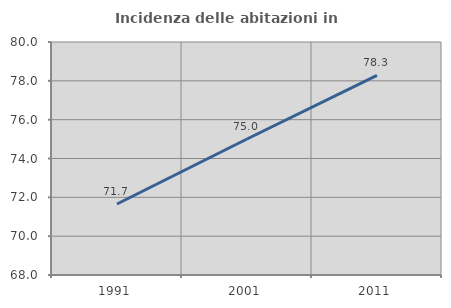
| Category | Incidenza delle abitazioni in proprietà  |
|---|---|
| 1991.0 | 71.658 |
| 2001.0 | 75.003 |
| 2011.0 | 78.285 |